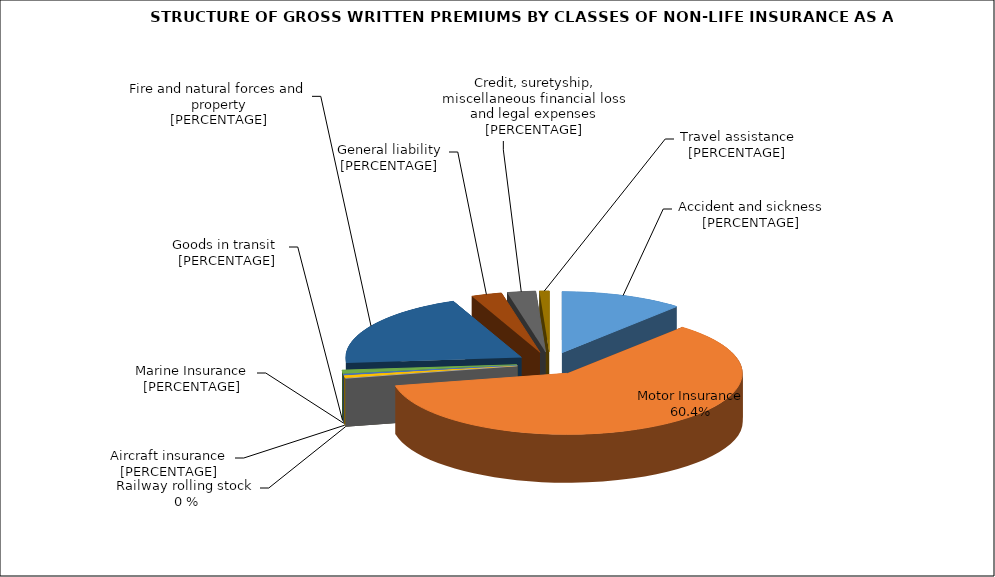
| Category | Злополука и заболяване |
|---|---|
| Злополука и заболяване | 0.113 |
| МПС | 0.604 |
| Релсови превозни средства | 0 |
| Летателни апарати | 0.006 |
| Плаванелни съдове | 0.003 |
| Товари по време на превоз | 0.009 |
| Пожар и природни бедствия и други щети на имущество | 0.201 |
| Обща гражданска отговорност | 0.028 |
| Кредити, гаранции, разни финансови загуби и правни разноски | 0.026 |
| Помощ при пътуване | 0.009 |